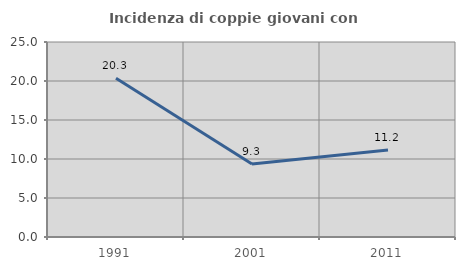
| Category | Incidenza di coppie giovani con figli |
|---|---|
| 1991.0 | 20.339 |
| 2001.0 | 9.35 |
| 2011.0 | 11.163 |